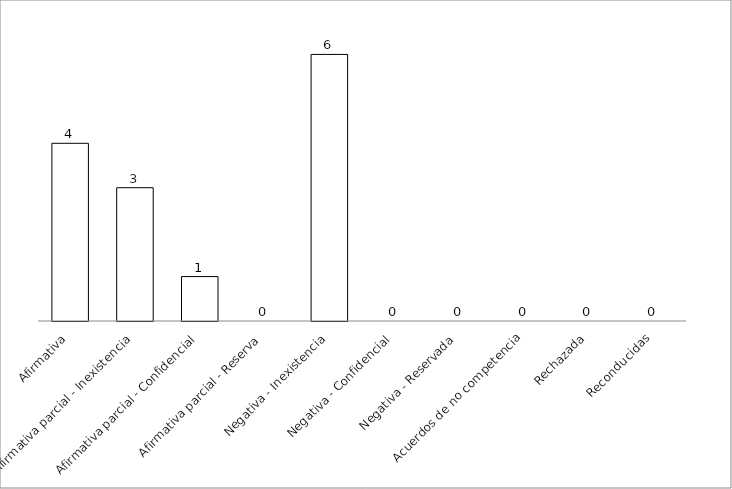
| Category | Series 0 |
|---|---|
| Afirmativa | 4 |
| Afirmativa parcial - Inexistencia | 3 |
| Afirmativa parcial - Confidencial | 1 |
| Afirmativa parcial - Reserva | 0 |
| Negativa - Inexistencia | 6 |
| Negativa - Confidencial | 0 |
| Negativa - Reservada | 0 |
| Acuerdos de no competencia | 0 |
| Rechazada | 0 |
| Reconducidas | 0 |